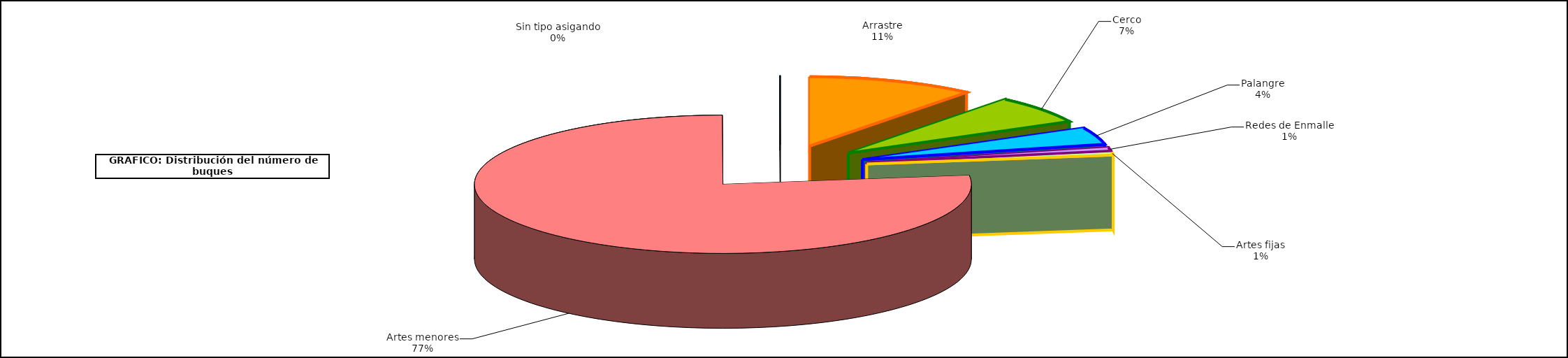
| Category | Series 0 |
|---|---|
| 0 | 1073 |
| 1 | 650 |
| 2 | 394 |
| 3 | 82 |
| 4 | 66 |
| 5 | 7602 |
| 6 | 4 |